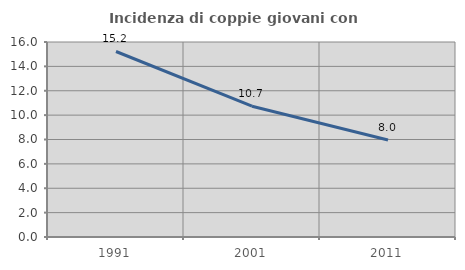
| Category | Incidenza di coppie giovani con figli |
|---|---|
| 1991.0 | 15.221 |
| 2001.0 | 10.734 |
| 2011.0 | 7.964 |